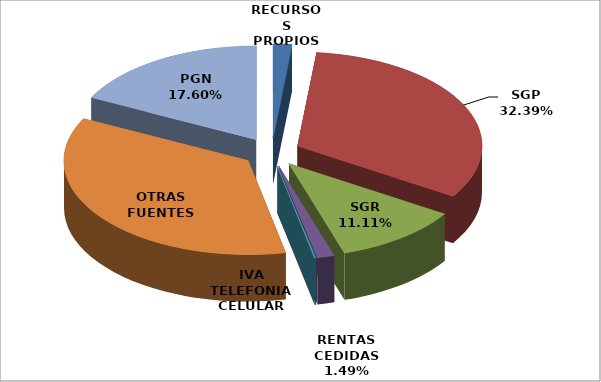
| Category | Series 0 |
|---|---|
| RECURSOS PROPIOS | 70559 |
| SGP | 1388454.384 |
| SGR | 476115.3 |
| RENTAS CEDIDAS | 64041 |
| IVA TELEFONIA CELULAR | 5622 |
| OTRAS FUENTES | 1527653.88 |
| PGN | 754269.3 |